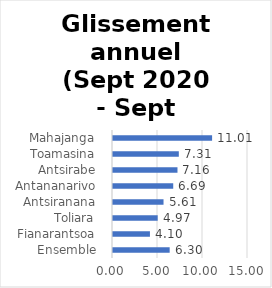
| Category | Glissement annuel |
|---|---|
|  Ensemble  | 6.297 |
|  Fianarantsoa  | 4.104 |
|  Toliara  | 4.966 |
|  Antsiranana  | 5.614 |
|  Antananarivo  | 6.692 |
|  Antsirabe  | 7.164 |
|  Toamasina  | 7.313 |
|  Mahajanga  | 11.011 |